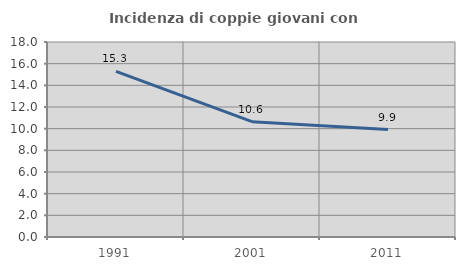
| Category | Incidenza di coppie giovani con figli |
|---|---|
| 1991.0 | 15.292 |
| 2001.0 | 10.644 |
| 2011.0 | 9.917 |